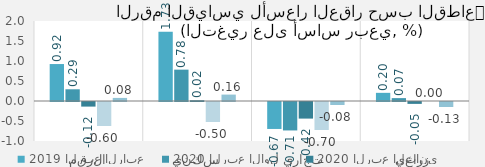
| Category | 2019 | 2020 |
|---|---|---|
| الرقم القياسي العام | 0.924 | 0.077 |
| سكني | 1.734 | 0.16 |
| تجاري | -0.674 | -0.075 |
| زراعي | 0.204 | -0.125 |